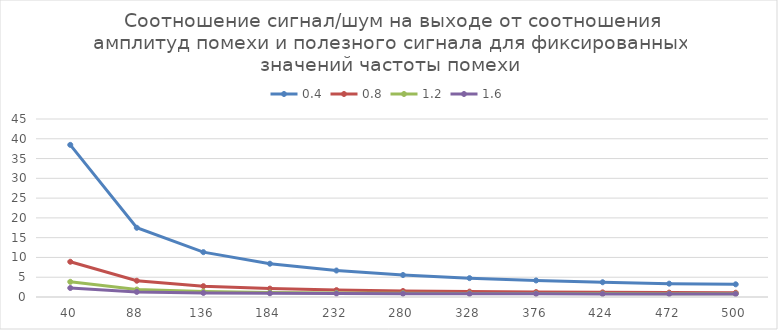
| Category | 0,4 | 0,8 | 1,2 | 1.6 |
|---|---|---|---|---|
| 40.0 | 38.46 | 8.91 | 3.84 | 2.28 |
| 88.0 | 17.5 | 4.11 | 1.89 | 1.28 |
| 136.0 | 11.34 | 2.74 | 1.38 | 1.03 |
| 184.0 | 8.41 | 2.12 | 1.15 | 0.93 |
| 232.0 | 6.69 | 1.74 | 1.03 | 0.87 |
| 280.0 | 5.56 | 1.51 | 0.96 | 0.84 |
| 328.0 | 4.77 | 1.36 | 0.91 | 0.81 |
| 376.0 | 4.18 | 1.25 | 0.88 | 0.8 |
| 424.0 | 3.73 | 1.17 | 0.86 | 0.79 |
| 472.0 | 3.37 | 1.11 | 0.84 | 0.78 |
| 500.0 | 3.21 | 1.08 | 0.83 | 0.77 |